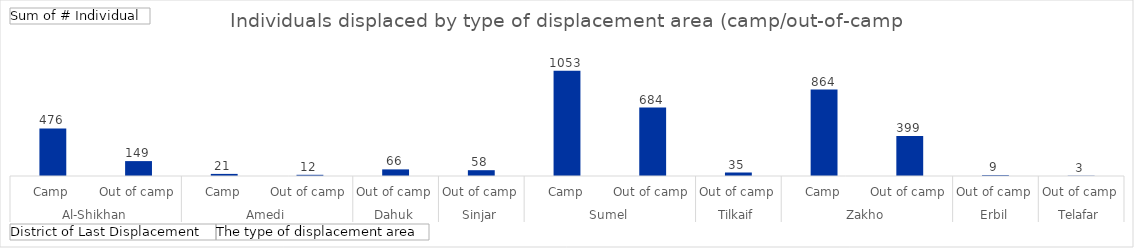
| Category | Total |
|---|---|
| 0 | 476 |
| 1 | 149 |
| 2 | 21 |
| 3 | 12 |
| 4 | 66 |
| 5 | 58 |
| 6 | 1053 |
| 7 | 684 |
| 8 | 35 |
| 9 | 864 |
| 10 | 399 |
| 11 | 9 |
| 12 | 3 |